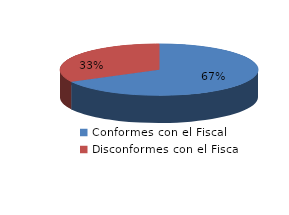
| Category | Series 0 |
|---|---|
| 0 | 316 |
| 1 | 154 |